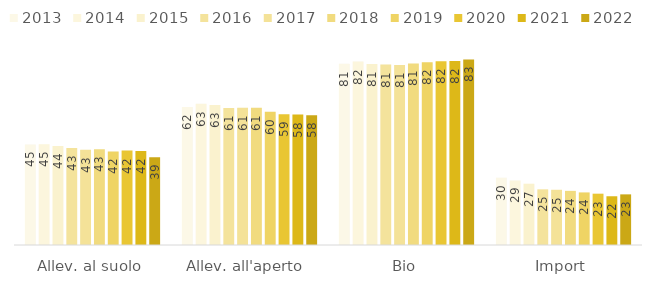
| Category | 2013 | 2014 | 2015 | 2016 | 2017 | 2018 | 2019 | 2020 | 2021 | 2022 |
|---|---|---|---|---|---|---|---|---|---|---|
| Allev. al suolo | 45.048 | 45.128 | 44.301 | 43.393 | 42.639 | 42.826 | 41.909 | 42.287 | 42.078 | 39.322 |
| Allev. all'aperto | 61.772 | 63.237 | 62.632 | 61.292 | 61.448 | 61.467 | 59.628 | 58.52 | 58.378 | 58.113 |
| Bio | 81.133 | 82.119 | 81.077 | 80.782 | 80.581 | 81.321 | 81.804 | 82.228 | 82.412 | 83.081 |
| Import | 30.153 | 28.893 | 27.448 | 24.927 | 24.739 | 24.238 | 23.541 | 22.979 | 21.823 | 22.671 |